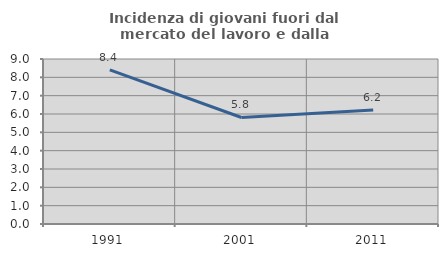
| Category | Incidenza di giovani fuori dal mercato del lavoro e dalla formazione  |
|---|---|
| 1991.0 | 8.408 |
| 2001.0 | 5.81 |
| 2011.0 | 6.222 |